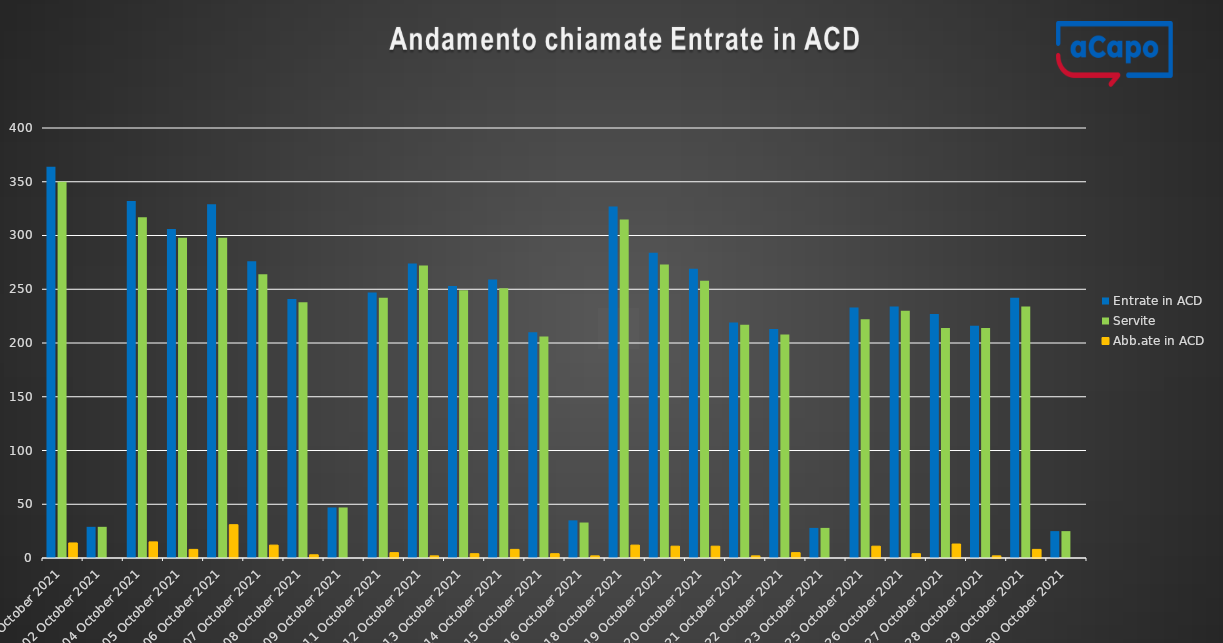
| Category | Entrate in ACD | Servite | Abb.ate in ACD |
|---|---|---|---|
| 2021-10-01 | 364 | 350 | 14 |
| 2021-10-02 | 29 | 29 | 0 |
| 2021-10-04 | 332 | 317 | 15 |
| 2021-10-05 | 306 | 298 | 8 |
| 2021-10-06 | 329 | 298 | 31 |
| 2021-10-07 | 276 | 264 | 12 |
| 2021-10-08 | 241 | 238 | 3 |
| 2021-10-09 | 47 | 47 | 0 |
| 2021-10-11 | 247 | 242 | 5 |
| 2021-10-12 | 274 | 272 | 2 |
| 2021-10-13 | 253 | 249 | 4 |
| 2021-10-14 | 259 | 251 | 8 |
| 2021-10-15 | 210 | 206 | 4 |
| 2021-10-16 | 35 | 33 | 2 |
| 2021-10-18 | 327 | 315 | 12 |
| 2021-10-19 | 284 | 273 | 11 |
| 2021-10-20 | 269 | 258 | 11 |
| 2021-10-21 | 219 | 217 | 2 |
| 2021-10-22 | 213 | 208 | 5 |
| 2021-10-23 | 28 | 28 | 0 |
| 2021-10-25 | 233 | 222 | 11 |
| 2021-10-26 | 234 | 230 | 4 |
| 2021-10-27 | 227 | 214 | 13 |
| 2021-10-28 | 216 | 214 | 2 |
| 2021-10-29 | 242 | 234 | 8 |
| 2021-10-30 | 25 | 25 | 0 |